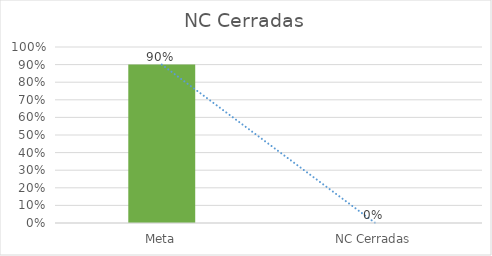
| Category | Series 0 |
|---|---|
| Meta | 0.9 |
| NC Cerradas | 0 |